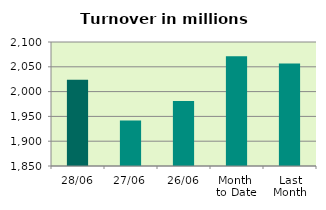
| Category | Series 0 |
|---|---|
| 28/06 | 2023.881 |
| 27/06 | 1941.943 |
| 26/06 | 1981.12 |
| Month 
to Date | 2071.376 |
| Last
Month | 2056.808 |